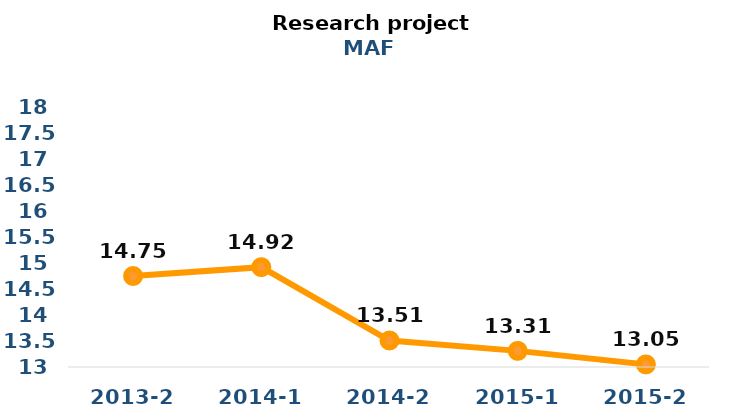
| Category | Series 0 |
|---|---|
| 2013-2 | 14.75 |
| 2014-1 | 14.92 |
| 2014-2 | 13.51 |
| 2015-1 | 13.31 |
| 2015-2 | 13.05 |